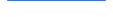
| Category | Series 0 |
|---|---|
| 0 | 92 |
| 1 | 85 |
| 2 | 98 |
| 3 | 70 |
| 4 | 59 |
| 5 | 64 |
| 6 | 73 |
| 7 | 74 |
| 8 | 66 |